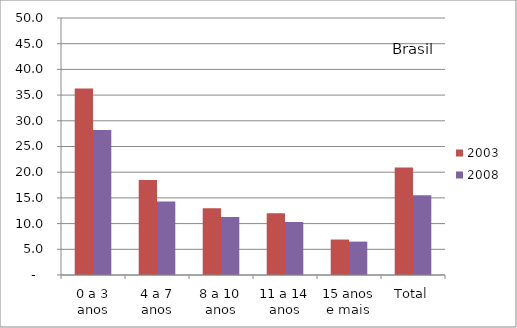
| Category | 2003 | 2008 |
|---|---|---|
| 0 a 3 anos | 36.3 | 28.2 |
| 4 a 7 anos | 18.5 | 14.3 |
| 8 a 10 anos | 13 | 11.3 |
| 11 a 14 anos | 12 | 10.3 |
| 15 anos e mais | 6.9 | 6.5 |
| Total | 20.9 | 15.5 |